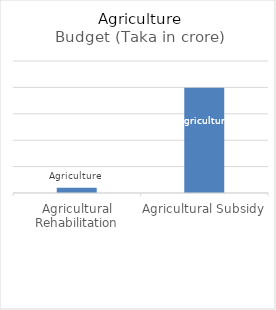
| Category | Budget (Taka in crore) |
|---|---|
| Agricultural Rehabilitation | 400 |
| Agricultural Subsidy | 7970 |